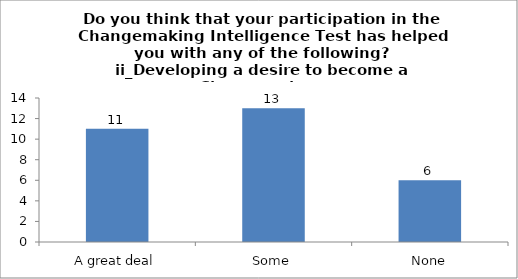
| Category | Do you think that your participation in the Changemaking Intelligence Test has helped you with any of the following?
ii_Developing a desire to become a Changemaker. |
|---|---|
| A great deal | 11 |
| Some | 13 |
| None | 6 |